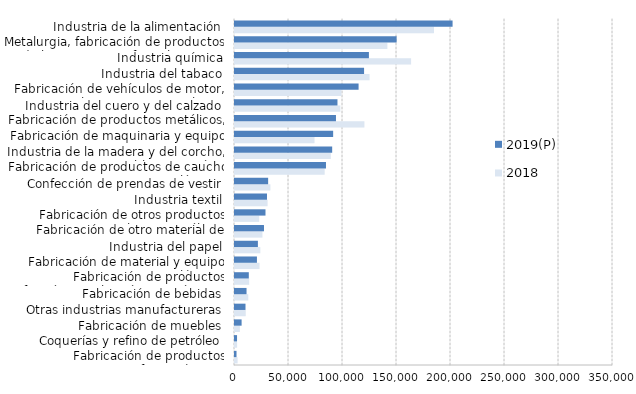
| Category | 2018 | 2019(P) |
|---|---|---|
| Fabricación de productos farmacéuticos | 2419.502 | 1403.738 |
| Coquerías y refino de petróleo | 1957.9 | 1896.173 |
| Fabricación de muebles | 4525.042 | 6118.417 |
| Otras industrias manufactureras | 9941.287 | 9721.131 |
| Fabricación de bebidas | 12300.176 | 10678.728 |
| Fabricación de productos informáticos, electrónicos y ópticos | 13148.952 | 12782.562 |
| Fabricación de material y equipo eléctrico | 22688.244 | 20305.164 |
| Industria del papel | 23443.597 | 21196.928 |
| Fabricación de otro material de transporte | 25421.946 | 26826.958 |
| Fabricación de otros productos minerales no metálicos | 22452.549 | 28231.401 |
| Industria textil | 30173.52 | 29616.926 |
| Confección de prendas de vestir | 32745.391 | 30683.655 |
| Fabricación de productos de caucho y plásticos | 83010.05 | 84234.793 |
| Industria de la madera y del corcho, excepto muebles, cestería y espartería | 88682.335 | 89983.156 |
| Fabricación de maquinaria y equipo n.c.o.p. | 73650.058 | 90886.833 |
| Fabricación de productos metálicos, excepto maquinaria y equipo | 119806.142 | 93491.287 |
| Industria del cuero y del calzado | 97537.44 | 94877.897 |
| Fabricación de vehículos de motor, remolques y semirremolques | 98569.662 | 114429.526 |
| Industria del tabaco | 124605.742 | 119516.477 |
| Industria química | 163062.697 | 123988.169 |
| Metalurgia, fabricación de productos de hierro, acero y ferroaleaciones | 141112.097 | 149646.114 |
| Industria de la alimentación | 184243.807 | 201463.512 |